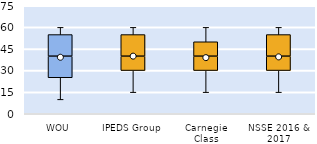
| Category | 25th | 50th | 75th |
|---|---|---|---|
| WOU | 25 | 15 | 15 |
| IPEDS Group | 30 | 10 | 15 |
| Carnegie Class | 30 | 10 | 10 |
| NSSE 2016 & 2017 | 30 | 10 | 15 |